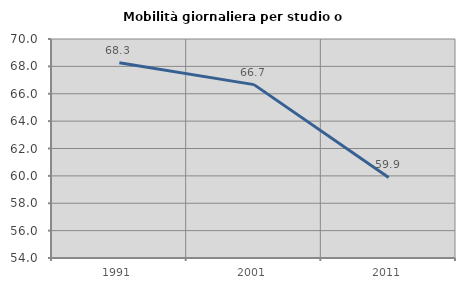
| Category | Mobilità giornaliera per studio o lavoro |
|---|---|
| 1991.0 | 68.263 |
| 2001.0 | 66.667 |
| 2011.0 | 59.884 |